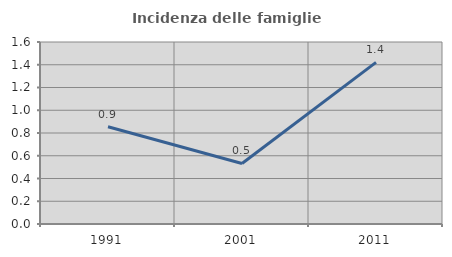
| Category | Incidenza delle famiglie numerose |
|---|---|
| 1991.0 | 0.855 |
| 2001.0 | 0.532 |
| 2011.0 | 1.421 |